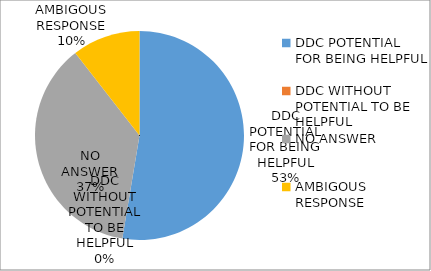
| Category | Series 0 |
|---|---|
| DDC POTENTIAL FOR BEING HELPFUL | 0.526 |
| DDC WITHOUT POTENTIAL TO BE HELPFUL | 0 |
| NO ANSWER | 0.368 |
| AMBIGOUS RESPONSE | 0.105 |